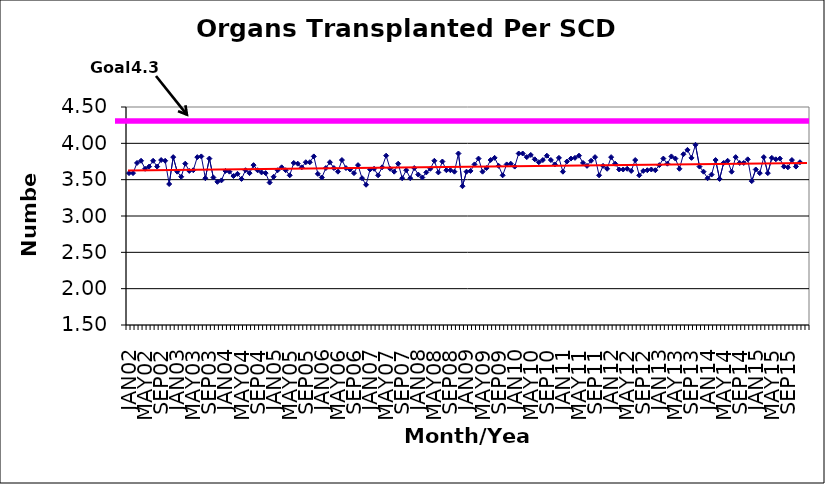
| Category | Series 0 |
|---|---|
| JAN02 | 3.59 |
| FEB02 | 3.59 |
| MAR02 | 3.73 |
| APR02 | 3.76 |
| MAY02 | 3.65 |
| JUN02 | 3.68 |
| JUL02 | 3.76 |
| AUG02 | 3.68 |
| SEP02 | 3.77 |
| OCT02 | 3.76 |
| NOV02 | 3.44 |
| DEC02 | 3.81 |
| JAN03 | 3.61 |
| FEB03 | 3.54 |
| MAR03 | 3.72 |
| APR03 | 3.62 |
| MAY03 | 3.63 |
| JUN03 | 3.81 |
| JUL03 | 3.82 |
| AUG03 | 3.52 |
| SEP03 | 3.79 |
| OCT03 | 3.53 |
| NOV03 | 3.47 |
| DEC03 | 3.49 |
| JAN04 | 3.62 |
| FEB04 | 3.61 |
| MAR04 | 3.55 |
| APR04 | 3.58 |
| MAY04 | 3.51 |
| JUN04 | 3.63 |
| JUL04 | 3.59 |
| AUG04 | 3.7 |
| SEP04 | 3.63 |
| OCT04 | 3.6 |
| NOV04 | 3.59 |
| DEC04 | 3.46 |
| JAN05 | 3.54 |
| FEB05 | 3.63 |
| MAR05 | 3.67 |
| APR05 | 3.63 |
| MAY05 | 3.56 |
| JUN05 | 3.73 |
| JUL05 | 3.72 |
| AUG05 | 3.67 |
| SEP05 | 3.74 |
| OCT05 | 3.74 |
| NOV05 | 3.82 |
| DEC05 | 3.58 |
| JAN06 | 3.53 |
| FEB06 | 3.66 |
| MAR06 | 3.74 |
| APR06 | 3.66 |
| MAY06 | 3.61 |
| JUN06 | 3.77 |
| JUL06 | 3.66 |
| AUG06 | 3.64 |
| SEP06 | 3.59 |
| OCT06 | 3.7 |
| NOV06 | 3.52 |
| DEC06 | 3.43 |
| JAN07 | 3.64 |
| FEB07 | 3.65 |
| MAR07 | 3.56 |
| APR07 | 3.67 |
| MAY07 | 3.83 |
| JUN07 | 3.65 |
| JUL07 | 3.61 |
| AUG07 | 3.72 |
| SEP07 | 3.52 |
| OCT07 | 3.63 |
| NOV07 | 3.52 |
| DEC07 | 3.66 |
| JAN08 | 3.57 |
| FEB08 | 3.53 |
| MAR08 | 3.6 |
| APR08 | 3.65 |
| MAY08 | 3.76 |
| JUN08 | 3.6 |
| JUL08 | 3.75 |
| AUG08 | 3.63 |
| SEP08 | 3.63 |
| OCT08 | 3.61 |
| NOV08 | 3.86 |
| DEC08 | 3.41 |
| JAN09 | 3.61 |
| FEB09 | 3.62 |
| MAR09 | 3.71 |
| APR09 | 3.79 |
| MAY09 | 3.61 |
| JUN09 | 3.66 |
| JUL09 | 3.77 |
| AUG09 | 3.8 |
| SEP09 | 3.69 |
| OCT09 | 3.56 |
| NOV09 | 3.71 |
| DEC09 | 3.72 |
| JAN10 | 3.68 |
| FEB10 | 3.86 |
| MAR10 | 3.86 |
| APR10 | 3.81 |
| MAY10 | 3.84 |
| JUN10 | 3.78 |
| JUL10 | 3.74 |
| AUG10 | 3.77 |
| SEP10 | 3.83 |
| OCT10 | 3.77 |
| NOV10 | 3.71 |
| DEC10 | 3.8 |
| JAN11 | 3.61 |
| FEB11 | 3.75 |
| MAR11 | 3.79 |
| APR11 | 3.8 |
| MAY11 | 3.83 |
| JUN11 | 3.73 |
| JUL11 | 3.69 |
| AUG11 | 3.76 |
| SEP11 | 3.81 |
| OCT11 | 3.56 |
| NOV11 | 3.69 |
| DEC11 | 3.65 |
| JAN12 | 3.81 |
| FEB12 | 3.72 |
| MAR12 | 3.64 |
| APR12 | 3.64 |
| MAY12 | 3.65 |
| JUN12 | 3.62 |
| JUL12 | 3.77 |
| AUG12 | 3.56 |
| SEP12 | 3.62 |
| OCT12 | 3.63 |
| NOV12 | 3.64 |
| DEC12 | 3.63 |
| JAN13 | 3.7 |
| FEB13 | 3.79 |
| MAR13 | 3.72 |
| APR13 | 3.82 |
| MAY13 | 3.79 |
| JUN13 | 3.65 |
| JUL13 | 3.85 |
| AUG13 | 3.91 |
| SEP13 | 3.8 |
| OCT13 | 3.98 |
| NOV13 | 3.68 |
| DEC13 | 3.61 |
| JAN14 | 3.52 |
| FEB14 | 3.57 |
| MAR14 | 3.77 |
| APR14 | 3.51 |
| MAY14 | 3.73 |
| JUN14 | 3.76 |
| JUL14 | 3.61 |
| AUG14 | 3.81 |
| SEP14 | 3.73 |
| OCT14 | 3.73 |
| NOV14 | 3.78 |
| DEC14 | 3.48 |
| JAN15 | 3.64 |
| FEB15 | 3.59 |
| MAR15 | 3.81 |
| APR15 | 3.59 |
| MAY15 | 3.8 |
| JUN15 | 3.78 |
| JUL15 | 3.79 |
| AUG15 | 3.68 |
| SEP15 | 3.67 |
| OCT15 | 3.77 |
| NOV15 | 3.68 |
| DEC15 | 3.74 |